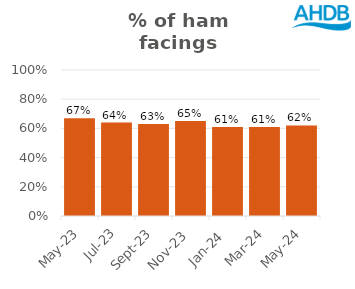
| Category | Ham |
|---|---|
| 2023-05-01 | 0.67 |
| 2023-07-01 | 0.64 |
| 2023-09-01 | 0.63 |
| 2023-11-01 | 0.65 |
| 2024-01-01 | 0.61 |
| 2024-03-01 | 0.61 |
| 2024-05-01 | 0.62 |